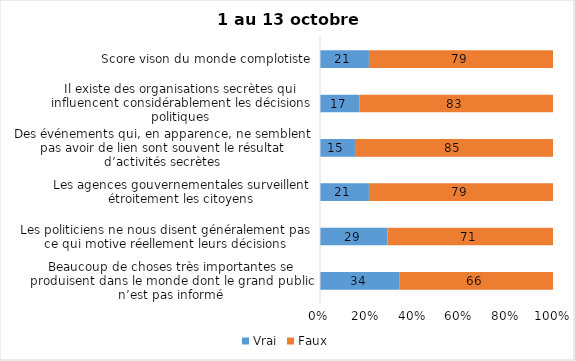
| Category | Vrai | Faux |
|---|---|---|
| Beaucoup de choses très importantes se produisent dans le monde dont le grand public n’est pas informé | 34 | 66 |
| Les politiciens ne nous disent généralement pas ce qui motive réellement leurs décisions | 29 | 71 |
| Les agences gouvernementales surveillent étroitement les citoyens | 21 | 79 |
| Des événements qui, en apparence, ne semblent pas avoir de lien sont souvent le résultat d’activités secrètes | 15 | 85 |
| Il existe des organisations secrètes qui influencent considérablement les décisions politiques | 17 | 83 |
| Score vison du monde complotiste | 21 | 79 |